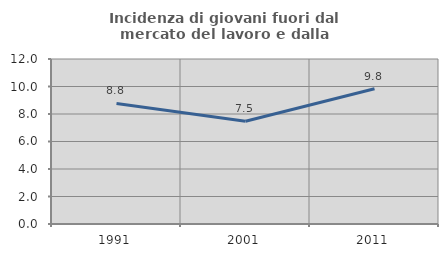
| Category | Incidenza di giovani fuori dal mercato del lavoro e dalla formazione  |
|---|---|
| 1991.0 | 8.769 |
| 2001.0 | 7.47 |
| 2011.0 | 9.833 |